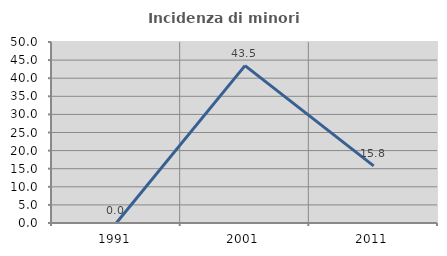
| Category | Incidenza di minori stranieri |
|---|---|
| 1991.0 | 0 |
| 2001.0 | 43.478 |
| 2011.0 | 15.789 |